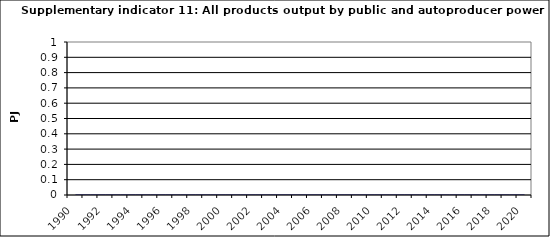
| Category | All products output by public and autoproducer power stations, PJ |
|---|---|
| 1990 | 0 |
| 1991 | 0 |
| 1992 | 0 |
| 1993 | 0 |
| 1994 | 0 |
| 1995 | 0 |
| 1996 | 0 |
| 1997 | 0 |
| 1998 | 0 |
| 1999 | 0 |
| 2000 | 0 |
| 2001 | 0 |
| 2002 | 0 |
| 2003 | 0 |
| 2004 | 0 |
| 2005 | 0 |
| 2006 | 0 |
| 2007 | 0 |
| 2008 | 0 |
| 2009 | 0 |
| 2010 | 0 |
| 2011 | 0 |
| 2012 | 0 |
| 2013 | 0 |
| 2014 | 0 |
| 2015 | 0 |
| 2016 | 0 |
| 2017 | 0 |
| 2018 | 0 |
| 2019 | 0 |
| 2020 | 0 |